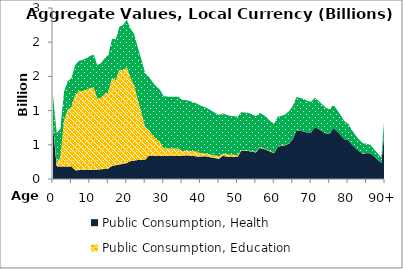
| Category | Public Consumption, Health | Public Consumption, Education | Public Consumption, Other than health and education |
|---|---|---|---|
| 0 | 769.989 | 12.475 | 445.475 |
|  | 185.89 | 55.955 | 427.755 |
| 2 | 182.954 | 132.729 | 421.021 |
| 3 | 181.924 | 678.549 | 418.699 |
| 4 | 182.538 | 829.075 | 420.107 |
| 5 | 185.172 | 862.901 | 426.157 |
| 6 | 126.912 | 1102.696 | 436.16 |
| 7 | 129.916 | 1150.791 | 446.479 |
| 8 | 132.584 | 1153.755 | 455.642 |
| 9 | 134.891 | 1168.632 | 463.581 |
| 10 | 137 | 1189.958 | 470.834 |
| 11 | 134.173 | 1206.153 | 478.613 |
| 12 | 137.503 | 1038.774 | 490.508 |
| 13 | 141.68 | 1047.071 | 505.417 |
| 14 | 146.664 | 1093.274 | 523.206 |
| 15 | 152.731 | 1114.728 | 544.875 |
| 16 | 191.945 | 1287.935 | 570.464 |
| 17 | 201.475 | 1241.084 | 598.787 |
| 18 | 211.417 | 1387.77 | 628.332 |
| 19 | 222.162 | 1366.792 | 660.249 |
| 20 | 233 | 1403.921 | 692.452 |
| 21 | 261.11 | 1214.035 | 722.102 |
| 22 | 270.435 | 1103.046 | 747.825 |
| 23 | 277.338 | 876.435 | 766.847 |
| 24 | 281.267 | 684.291 | 777.625 |
| 25 | 282.713 | 478.185 | 781.557 |
| 26 | 342.719 | 373.32 | 780.823 |
| 27 | 340.63 | 299.055 | 775.903 |
| 28 | 338.006 | 245.103 | 769.735 |
| 29 | 335.733 | 204.67 | 764.379 |
| 30 | 334.288 | 116.147 | 760.697 |
| 31 | 338.617 | 107.476 | 758.438 |
| 32 | 337.92 | 107.476 | 756.462 |
| 33 | 338.494 | 107.476 | 757.3 |
| 34 | 338.46 | 107.476 | 756.903 |
| 35 | 335.343 | 69.635 | 749.594 |
| 36 | 346.399 | 69.635 | 738.936 |
| 37 | 341.81 | 69.635 | 728.972 |
| 38 | 336.19 | 69.635 | 716.842 |
| 39 | 330.219 | 69.635 | 703.934 |
| 40 | 325.536 | 52.873 | 693.808 |
| 41 | 333.806 | 41.015 | 681.702 |
| 42 | 325.125 | 40.302 | 663.954 |
| 43 | 314.777 | 39.597 | 642.788 |
| 44 | 304.835 | 38.888 | 622.464 |
| 45 | 296.365 | 34.239 | 605.174 |
| 46 | 337.603 | 33.529 | 589.915 |
| 47 | 329.591 | 32.82 | 575.916 |
| 48 | 324.715 | 32.112 | 567.385 |
| 49 | 324.144 | 31.402 | 566.355 |
| 50 | 321.929 | 24.257 | 562.442 |
| 51 | 412.357 | 8.915 | 555.143 |
| 52 | 410.928 | 8.206 | 553.244 |
| 53 | 408.522 | 7.493 | 550.025 |
| 54 | 399.978 | 6.788 | 538.537 |
| 55 | 387.596 | 9.535 | 521.881 |
| 56 | 454.687 | 8.822 | 502 |
| 57 | 442.158 | 8.117 | 488.216 |
| 58 | 422.86 | 7.408 | 466.992 |
| 59 | 395.354 | 6.699 | 436.742 |
| 60 | 383.599 | 5.989 | 423.902 |
| 61 | 478.002 | 5.281 | 431.597 |
| 62 | 482.406 | 5.281 | 435.888 |
| 63 | 493.374 | 5.281 | 445.979 |
| 64 | 519.155 | 5.281 | 469.43 |
| 65 | 582.497 | 1.579 | 483.329 |
| 66 | 712.26 | 1.579 | 484.006 |
| 67 | 704.502 | 1.579 | 478.948 |
| 68 | 694.936 | 1.579 | 472.755 |
| 69 | 678.08 | 1.579 | 461.621 |
| 70 | 681.826 | 1.579 | 445.723 |
| 71 | 759.507 | 0 | 429.546 |
| 72 | 728.973 | 0 | 412.739 |
| 73 | 696.403 | 0 | 394.752 |
| 74 | 663.865 | 0 | 376.762 |
| 75 | 660.178 | 0 | 359.107 |
| 76 | 744.668 | 0 | 340.079 |
| 77 | 695.548 | 0 | 318.017 |
| 78 | 639.88 | 0 | 292.962 |
| 79 | 579.664 | 0 | 265.819 |
| 80 | 570.934 | 0 | 238.637 |
| 81 | 506.19 | 0 | 212.337 |
| 82 | 450.412 | 0 | 189.097 |
| 83 | 405.62 | 0 | 170.405 |
| 84 | 367.289 | 0 | 154.389 |
| 85 | 377.262 | 0 | 138.708 |
| 86 | 376.908 | 0 | 123.522 |
| 87 | 330.196 | 0 | 108.19 |
| 88 | 282.669 | 0 | 92.598 |
| 89 | 236.401 | 0 | 77.425 |
| 90+ | 766.375 | 0 | 247.723 |